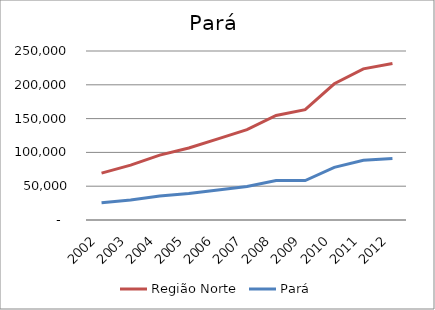
| Category | Região Norte | Pará |
|---|---|---|
| 2002.0 | 69309.957 | 25659.111 |
| 2003.0 | 81199.581 | 29754.565 |
| 2004.0 | 96012.341 | 35562.846 |
| 2005.0 | 106441.71 | 39121.138 |
| 2006.0 | 119993.429 | 44369.675 |
| 2007.0 | 133578.391 | 49507.144 |
| 2008.0 | 154703.433 | 58518.557 |
| 2009.0 | 163207.956 | 58401.83 |
| 2010.0 | 201510.748 | 77847.597 |
| 2011.0 | 223537.9 | 88370.61 |
| 2012.0 | 231383.089 | 91009.014 |